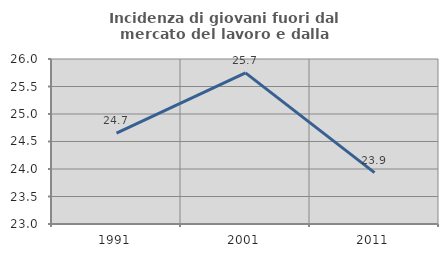
| Category | Incidenza di giovani fuori dal mercato del lavoro e dalla formazione  |
|---|---|
| 1991.0 | 24.652 |
| 2001.0 | 25.747 |
| 2011.0 | 23.934 |